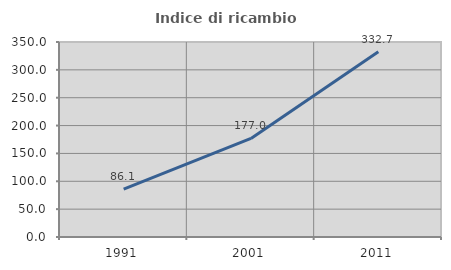
| Category | Indice di ricambio occupazionale  |
|---|---|
| 1991.0 | 86.062 |
| 2001.0 | 176.982 |
| 2011.0 | 332.653 |